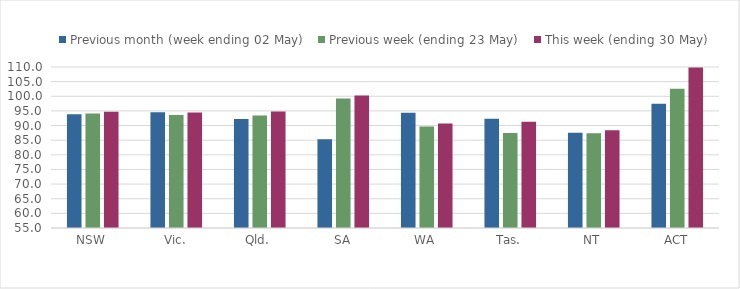
| Category | Previous month (week ending 02 May) | Previous week (ending 23 May) | This week (ending 30 May) |
|---|---|---|---|
| NSW | 93.858 | 94.15 | 94.691 |
| Vic. | 94.551 | 93.623 | 94.431 |
| Qld. | 92.236 | 93.417 | 94.822 |
| SA | 85.33 | 99.216 | 100.287 |
| WA | 94.407 | 89.66 | 90.708 |
| Tas. | 92.334 | 87.456 | 91.338 |
| NT | 87.554 | 87.339 | 88.429 |
| ACT | 97.436 | 102.564 | 109.846 |